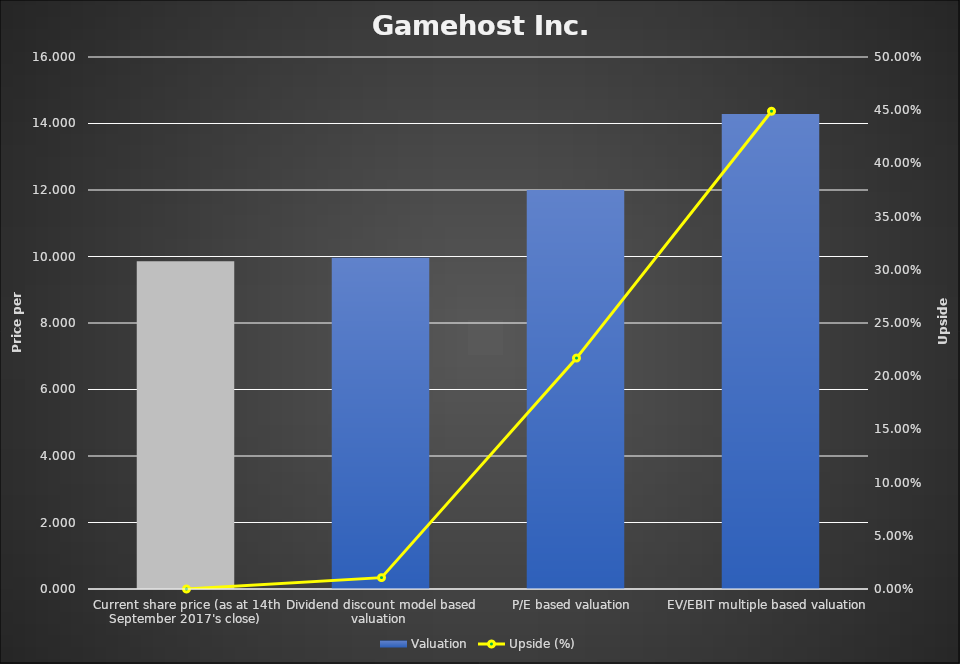
| Category | Valuation |
|---|---|
| Current share price (as at 14th September 2017's close) | 9.86 |
| Dividend discount model based valuation | 9.965 |
| P/E based valuation | 12 |
| EV/EBIT multiple based valuation | 14.287 |